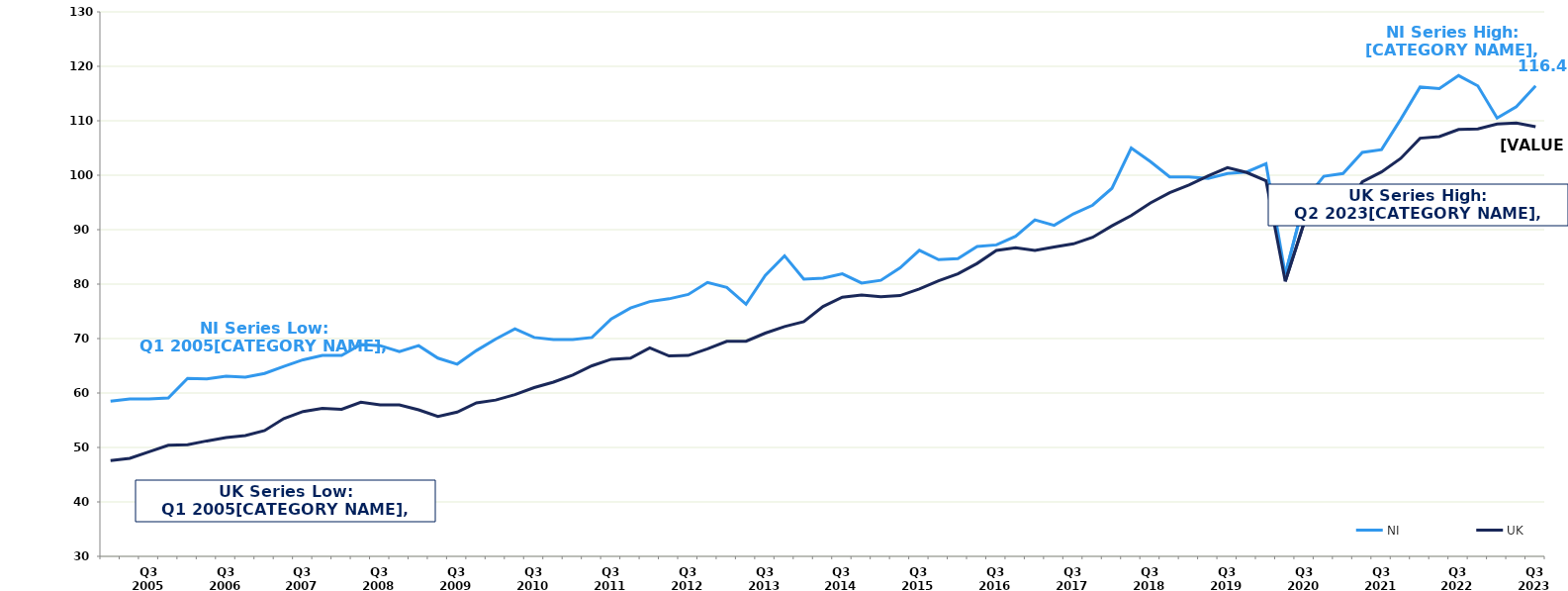
| Category | NI | UK |
|---|---|---|
|  | 58.5 | 47.6 |
|  | 58.9 | 48 |
| Q3 2005 | 58.9 | 49.2 |
|  | 59.1 | 50.4 |
|  | 62.7 | 50.5 |
|  | 62.6 | 51.2 |
| Q3 2006 | 63.1 | 51.8 |
|  | 62.9 | 52.2 |
|  | 63.6 | 53.1 |
|  | 64.9 | 55.3 |
| Q3 2007 | 66.1 | 56.6 |
|  | 66.9 | 57.2 |
|  | 66.9 | 57 |
|  | 68.9 | 58.3 |
| Q3 2008 | 68.7 | 57.8 |
|  | 67.6 | 57.8 |
|  | 68.7 | 56.9 |
|  | 66.4 | 55.7 |
| Q3 2009 | 65.3 | 56.5 |
|  | 67.8 | 58.2 |
|  | 69.9 | 58.7 |
|  | 71.8 | 59.7 |
| Q3 2010 | 70.2 | 61 |
|  | 69.8 | 62 |
|  | 69.8 | 63.3 |
|  | 70.2 | 65 |
| Q3 2011 | 73.6 | 66.2 |
|  | 75.6 | 66.4 |
|  | 76.8 | 68.3 |
|  | 77.3 | 66.8 |
| Q3 2012 | 78.1 | 66.9 |
|  | 80.3 | 68.1 |
|  | 79.4 | 69.5 |
|  | 76.3 | 69.5 |
| Q3 2013 | 81.6 | 71 |
|  | 85.2 | 72.2 |
|  | 80.9 | 73.1 |
|  | 81.1 | 75.9 |
| Q3 2014 | 81.9 | 77.6 |
|  | 80.2 | 78 |
|  | 80.7 | 77.7 |
|  | 83 | 77.9 |
| Q3 2015 | 86.2 | 79.1 |
|  | 84.5 | 80.6 |
|  | 84.7 | 81.9 |
|  | 86.9 | 83.8 |
| Q3 2016 | 87.2 | 86.2 |
|  | 88.8 | 86.7 |
|  | 91.8 | 86.2 |
|  | 90.8 | 86.8 |
| Q3 2017 | 92.9 | 87.4 |
|  | 94.5 | 88.6 |
|  | 97.6 | 90.7 |
|  | 105 | 92.6 |
| Q3 2018 | 102.5 | 94.9 |
|  | 99.7 | 96.8 |
|  | 99.7 | 98.2 |
|  | 99.4 | 99.9 |
| Q3 2019 | 100.3 | 101.4 |
|  | 100.6 | 100.5 |
|  | 102.1 | 99 |
|  | 81.8 | 80.5 |
| Q3 2020 | 95.4 | 91.5 |
|  | 99.8 | 94 |
|  | 100.3 | 93.2 |
|  | 104.2 | 98.8 |
| Q3 2021 | 104.7 | 100.6 |
|  | 110.3 | 103.1 |
|  | 116.2 | 106.8 |
|  | 115.9 | 107.1 |
| Q3 2022 | 118.3 | 108.4 |
|  | 116.4 | 108.5 |
|  | 110.5 | 109.4 |
|  | 112.6 | 109.6 |
| Q3 2023 | 116.4 | 108.9 |